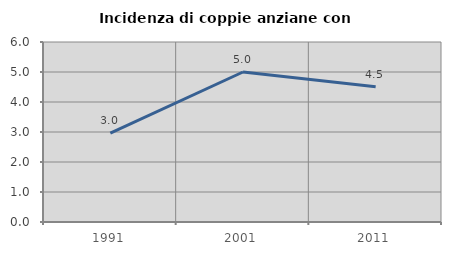
| Category | Incidenza di coppie anziane con figli |
|---|---|
| 1991.0 | 2.963 |
| 2001.0 | 5 |
| 2011.0 | 4.507 |